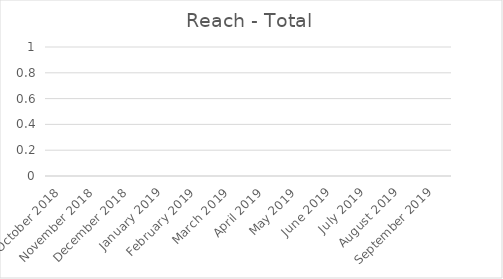
| Category | Total |
|---|---|
| October 2018 | 0 |
| November 2018 | 0 |
| December 2018 | 0 |
| January 2019 | 0 |
| February 2019 | 0 |
| March 2019 | 0 |
| April 2019 | 0 |
| May 2019 | 0 |
| June 2019 | 0 |
| July 2019 | 0 |
| August 2019 | 0 |
| September 2019 | 0 |